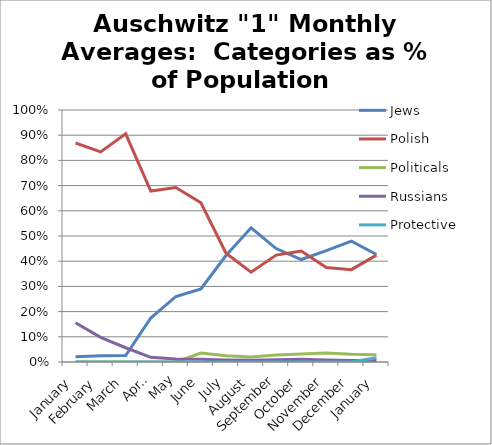
| Category | Jews | Polish | Politicals | Russians | Protective Custody |
|---|---|---|---|---|---|
| January | 0.021 | 0.869 | 0 | 0.156 | 0 |
| February | 0.025 | 0.834 | 0 | 0.098 | 0 |
| March | 0.026 | 0.905 | 0 | 0.057 | 0 |
| April | 0.175 | 0.678 | 0 | 0.018 | 0 |
| May | 0.26 | 0.693 | 0 | 0.012 | 0 |
| June | 0.29 | 0.632 | 0.036 | 0.01 | 0 |
| July | 0.423 | 0.431 | 0.025 | 0.008 | 0 |
| August | 0.533 | 0.356 | 0.02 | 0.007 | 0 |
| September | 0.45 | 0.424 | 0.027 | 0.009 | 0 |
| October | 0.407 | 0.44 | 0.032 | 0.01 | 0 |
| November | 0.442 | 0.375 | 0.036 | 0.008 | 0 |
| December | 0.48 | 0.367 | 0.031 | 0.006 | 0 |
| January | 0.427 | 0.424 | 0.029 | 0.006 | 0.017 |